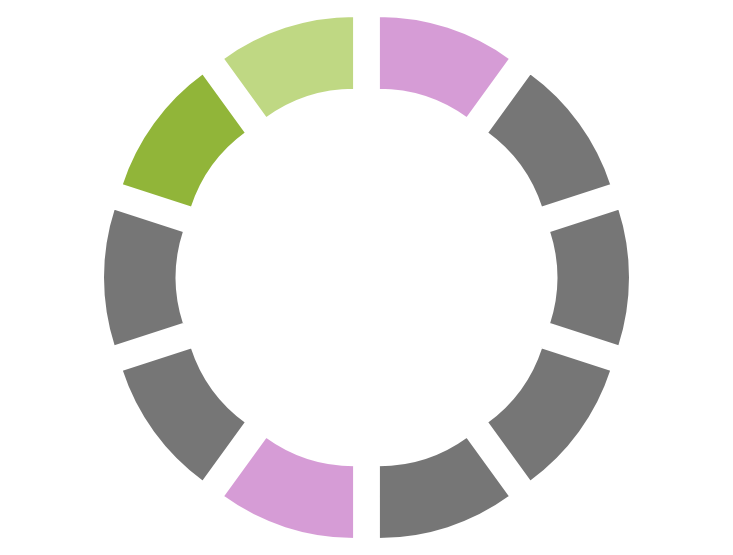
| Category | Series 0 |
|---|---|
| 0 | 0 |
| 1 | 0 |
| 2 | 0 |
| 3 | 1 |
| 4 | 0 |
| 5 | 0 |
| 6 | 0 |
| 7 | 0 |
| 8 | 1 |
| 9 | 0 |
| 10 | 0 |
| 11 | 0 |
| 12 | 0 |
| 13 | 0 |
| 14 | 1 |
| 15 | 0 |
| 16 | 0 |
| 17 | 0 |
| 18 | 0 |
| 19 | 0 |
| 20 | 1 |
| 21 | 0 |
| 22 | 0 |
| 23 | 0 |
| 24 | 0 |
| 25 | 0 |
| 26 | 1 |
| 27 | 0 |
| 28 | 0 |
| 29 | 0 |
| 30 | 0 |
| 31 | 0 |
| 32 | 0 |
| 33 | 1 |
| 34 | 0 |
| 35 | 0 |
| 36 | 0 |
| 37 | 0 |
| 38 | 1 |
| 39 | 0 |
| 40 | 0 |
| 41 | 0 |
| 42 | 0 |
| 43 | 0 |
| 44 | 1 |
| 45 | 0 |
| 46 | 0 |
| 47 | 0 |
| 48 | 1 |
| 49 | 0 |
| 50 | 0 |
| 51 | 0 |
| 52 | 0 |
| 53 | 0 |
| 54 | 0 |
| 55 | 1 |
| 56 | 0 |
| 57 | 0 |
| 58 | 0 |
| 59 | 0 |